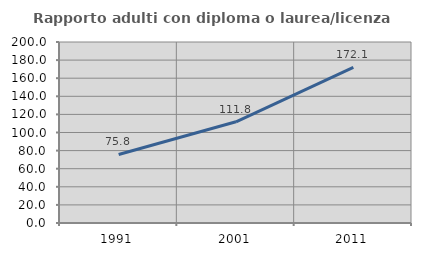
| Category | Rapporto adulti con diploma o laurea/licenza media  |
|---|---|
| 1991.0 | 75.753 |
| 2001.0 | 111.803 |
| 2011.0 | 172.055 |